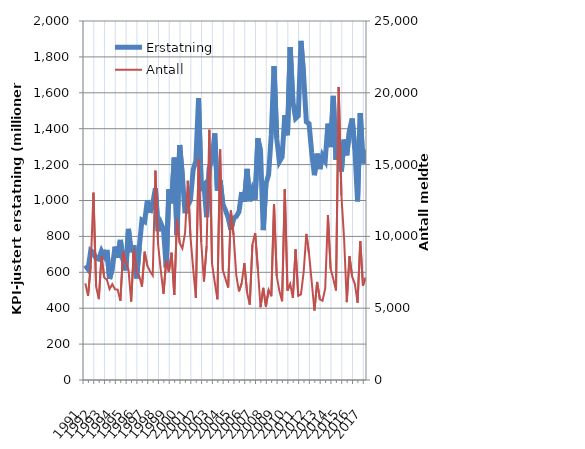
| Category | Erstatning |
|---|---|
| 1991.0 | 638.305 |
| nan | 617.49 |
| nan | 720.489 |
| nan | 708.243 |
| 1992.0 | 677.664 |
| nan | 673.336 |
| nan | 718.939 |
| nan | 690.111 |
| 1993.0 | 724.645 |
| nan | 562.774 |
| nan | 620.914 |
| nan | 743.095 |
| 1994.0 | 680.401 |
| nan | 780.53 |
| nan | 668.973 |
| nan | 610.787 |
| 1995.0 | 841.824 |
| nan | 711.536 |
| nan | 750.775 |
| nan | 566.189 |
| 1996.0 | 737.681 |
| nan | 891.182 |
| nan | 882.294 |
| nan | 1001.12 |
| 1997.0 | 931.155 |
| nan | 984.699 |
| nan | 1067.548 |
| nan | 829.951 |
| 1998.0 | 874.341 |
| nan | 837.865 |
| nan | 627.95 |
| nan | 1062.058 |
| 1999.0 | 984.04 |
| nan | 1239.159 |
| nan | 807.292 |
| nan | 1308.796 |
| 2000.0 | 1135.005 |
| nan | 928.869 |
| nan | 971.109 |
| nan | 1002.211 |
| 2001.0 | 1171.491 |
| nan | 1219.438 |
| nan | 1570.162 |
| nan | 1070.081 |
| 2002.0 | 1086.861 |
| nan | 907.106 |
| nan | 1183.634 |
| nan | 1224.277 |
| 2003.0 | 1373.705 |
| nan | 1054.474 |
| nan | 1113.11 |
| nan | 980.293 |
| 2004.0 | 945.444 |
| nan | 904.425 |
| nan | 836.38 |
| nan | 901.062 |
| 2005.0 | 910.826 |
| nan | 937.052 |
| nan | 1046.812 |
| nan | 993.378 |
| 2006.0 | 1176.283 |
| nan | 996.283 |
| nan | 1056.559 |
| nan | 1005.082 |
| 2007.0 | 1345.962 |
| nan | 1275.048 |
| nan | 835.366 |
| nan | 1092.832 |
| 2008.0 | 1144.621 |
| nan | 1369.428 |
| nan | 1748.539 |
| nan | 1346.977 |
| 2009.0 | 1216.204 |
| nan | 1241.686 |
| nan | 1475.828 |
| nan | 1363.591 |
| 2010.0 | 1854.723 |
| nan | 1552.135 |
| nan | 1457.291 |
| nan | 1471.348 |
| 2011.0 | 1889.184 |
| nan | 1694.934 |
| nan | 1438.377 |
| nan | 1427.875 |
| 2012.0 | 1264.734 |
| nan | 1141.025 |
| nan | 1260.942 |
| nan | 1174.868 |
| 2013.0 | 1250.053 |
| nan | 1222.343 |
| nan | 1427.919 |
| nan | 1297.809 |
| 2014.0 | 1583.326 |
| nan | 1227.429 |
| nan | 1331.604 |
| nan | 1162.233 |
| 2015.0 | 1339.019 |
| nan | 1251.691 |
| nan | 1390.064 |
| nan | 1456.52 |
| 2016.0 | 1285.825 |
| nan | 994.954 |
| nan | 1487.318 |
| nan | 1206.287 |
| 2017.0 | 1282.089 |